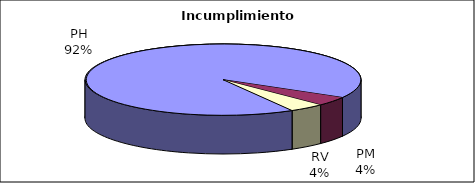
| Category | Efectivo |
|---|---|
| PH | 22 |
| PM | 1 |
| RV | 1 |